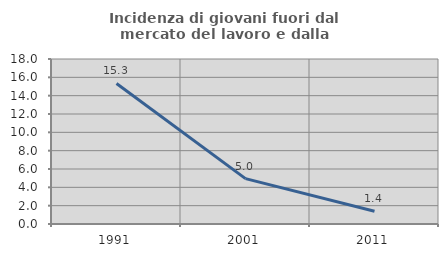
| Category | Incidenza di giovani fuori dal mercato del lavoro e dalla formazione  |
|---|---|
| 1991.0 | 15.328 |
| 2001.0 | 4.95 |
| 2011.0 | 1.389 |